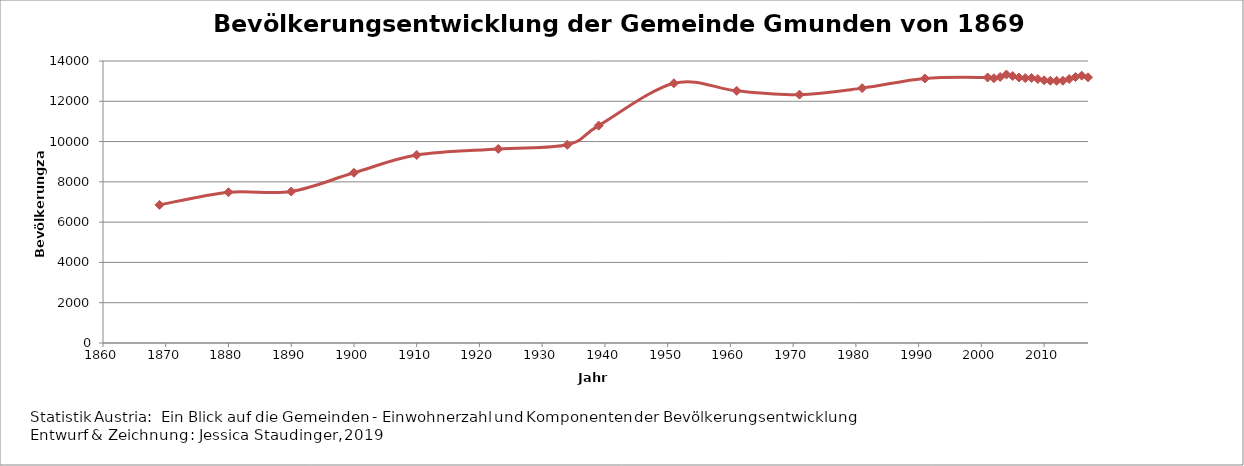
| Category | Series 1 |
|---|---|
| 1869.0 | 6857 |
| 1880.0 | 7485 |
| 1890.0 | 7521 |
| 1900.0 | 8451 |
| 1910.0 | 9332 |
| 1923.0 | 9633 |
| 1934.0 | 9838 |
| 1939.0 | 10792 |
| 1951.0 | 12894 |
| 1961.0 | 12518 |
| 1971.0 | 12331 |
| 1981.0 | 12653 |
| 1991.0 | 13133 |
| 2001.0 | 13182 |
| 2002.0 | 13142 |
| 2003.0 | 13205 |
| 2004.0 | 13329 |
| 2005.0 | 13254 |
| 2006.0 | 13180 |
| 2007.0 | 13152 |
| 2008.0 | 13158 |
| 2009.0 | 13104 |
| 2010.0 | 13041 |
| 2011.0 | 13021 |
| 2012.0 | 13015 |
| 2013.0 | 13021 |
| 2014.0 | 13105 |
| 2015.0 | 13204 |
| 2016.0 | 13272 |
| 2017.0 | 13191 |